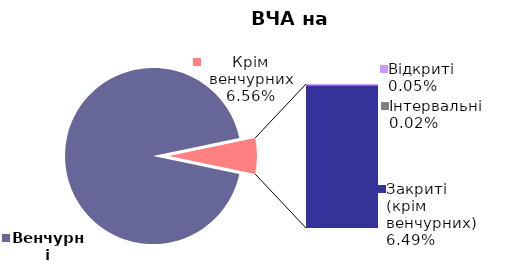
| Category | 44561 |
|---|---|
| Венчурні | 0.934 |
| Відкриті | 0 |
| Інтервальні | 0 |
| Закриті (крім венчурних) | 0.065 |